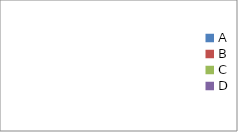
| Category | Series 0 |
|---|---|
| A | 0 |
| B | 0 |
| C | 0 |
| D | 0 |